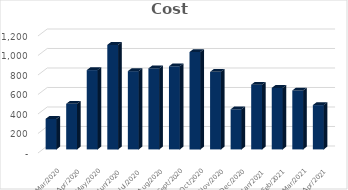
| Category | Cost |
|---|---|
| 2021-04-30 | 454.54 |
| 2021-03-31 | 604.61 |
| 2021-02-28 | 630.68 |
| 2021-01-31 | 663.81 |
| 2020-12-31 | 411.64 |
| 2020-11-30 | 795.41 |
| 2020-10-31 | 998.75 |
| 2020-09-30 | 852.74 |
| 2020-08-31 | 830.9 |
| 2020-07-31 | 802.57 |
| 2020-06-30 | 1072.01 |
| 2020-05-31 | 813.49 |
| 2020-04-30 | 467.96 |
| 2020-03-31 | 312.97 |